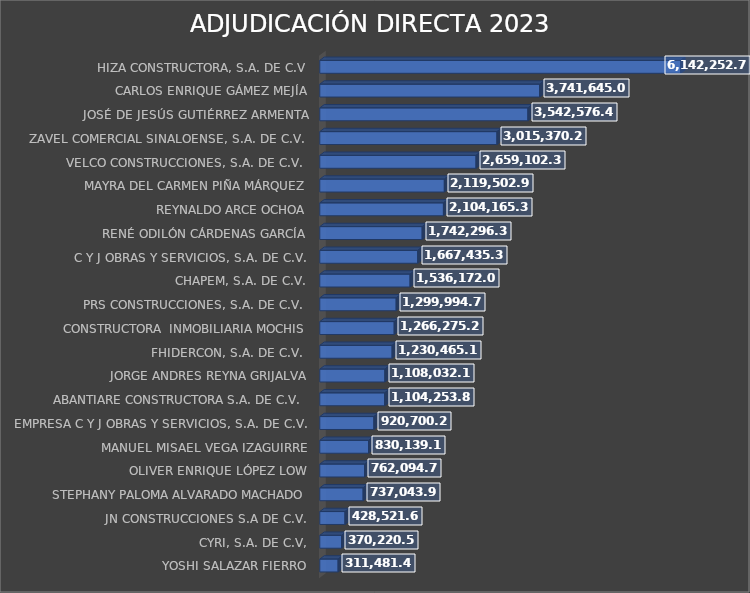
| Category | SUMA |
|---|---|
| YOSHI SALAZAR FIERRO | 311481.42 |
| CYRI, S.A. DE C.V, | 370220.58 |
| JN CONSTRUCCIONES S.A DE C.V. | 428521.66 |
| STEPHANY PALOMA ALVARADO MACHADO | 737043.99 |
| OLIVER ENRIQUE LÓPEZ LOW | 762094.76 |
| MANUEL MISAEL VEGA IZAGUIRRE | 830139.11 |
| EMPRESA C Y J OBRAS Y SERVICIOS, S.A. DE C.V. | 920700.2 |
| ABANTIARE CONSTRUCTORA S.A. DE C.V.  | 1104253.89 |
| JORGE ANDRES REYNA GRIJALVA | 1108032.13 |
| FHIDERCON, S.A. DE C.V.  | 1230465.18 |
| CONSTRUCTORA  INMOBILIARIA MOCHIS | 1266275.24 |
| PRS CONSTRUCCIONES, S.A. DE C.V.  | 1299994.77 |
| CHAPEM, S.A. DE C.V. | 1536172.05 |
| C Y J OBRAS Y SERVICIOS, S.A. DE C.V. | 1667435.37 |
| RENÉ ODILÓN CÁRDENAS GARCÍA | 1742296.37 |
| REYNALDO ARCE OCHOA | 2104165.39 |
| MAYRA DEL CARMEN PIÑA MÁRQUEZ | 2119502.95 |
| VELCO CONSTRUCCIONES, S.A. DE C.V.  | 2659102.38 |
| ZAVEL COMERCIAL SINALOENSE, S.A. DE C.V.  | 3015370.24 |
| JOSÉ DE JESÚS GUTIÉRREZ ARMENTA | 3542576.42 |
| CARLOS ENRIQUE GÁMEZ MEJÍA | 3741645.02 |
| HIZA CONSTRUCTORA, S.A. DE C.V | 6142252.73 |